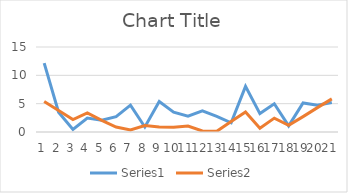
| Category | Series 0 | Series 1 |
|---|---|---|
| 0 | 12.154 | 5.372 |
| 1 | 3.492 | 3.788 |
| 2 | 0.436 | 2.204 |
| 3 | 2.447 | 3.373 |
| 4 | 2.081 | 2.047 |
| 5 | 2.699 | 0.878 |
| 6 | 4.732 | 0.373 |
| 7 | 0.89 | 1.148 |
| 8 | 5.373 | 0.874 |
| 9 | 3.485 | 0.841 |
| 10 | 2.788 | 1.054 |
| 11 | 3.743 | 0.178 |
| 12 | 2.777 | 0.114 |
| 13 | 1.627 | 1.833 |
| 14 | 8.047 | 3.548 |
| 15 | 3.249 | 0.654 |
| 16 | 4.979 | 2.447 |
| 17 | 1.081 | 1.178 |
| 18 | 5.125 | 2.717 |
| 19 | 4.71 | 4.301 |
| 20 | 5.215 | 5.84 |